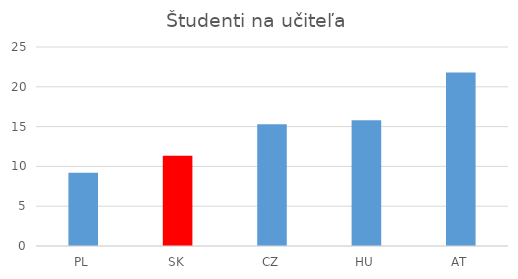
| Category | Študenti na učiteľa |
|---|---|
| PL | 9.2 |
| SK | 11.333 |
| CZ | 15.3 |
| HU | 15.8 |
| AT | 21.8 |